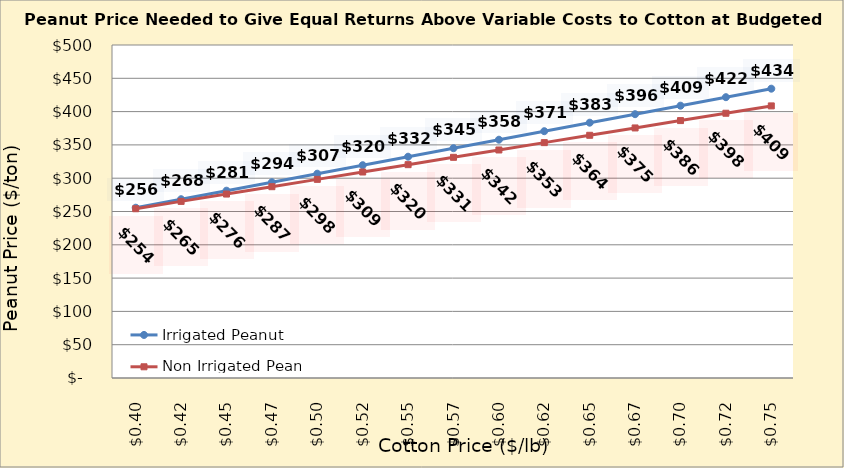
| Category | Irrigated Peanut | Non Irrigated Peanut |
|---|---|---|
| 0.3949999999999998 | 255.686 | 254.146 |
| 0.4199999999999998 | 268.452 | 265.175 |
| 0.44499999999999984 | 281.218 | 276.205 |
| 0.46999999999999986 | 293.984 | 287.234 |
| 0.4949999999999999 | 306.75 | 298.263 |
| 0.5199999999999999 | 319.516 | 309.293 |
| 0.5449999999999999 | 332.281 | 320.322 |
| 0.57 | 345.047 | 331.352 |
| 0.595 | 357.813 | 342.381 |
| 0.62 | 370.579 | 353.41 |
| 0.645 | 383.345 | 364.44 |
| 0.67 | 396.111 | 375.469 |
| 0.6950000000000001 | 408.877 | 386.499 |
| 0.7200000000000001 | 421.643 | 397.528 |
| 0.7450000000000001 | 434.409 | 408.557 |